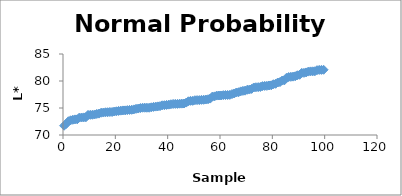
| Category | Series 0 |
|---|---|
| 0.4166666666666667 | 71.72 |
| 1.25 | 72.05 |
| 2.0833333333333335 | 72.55 |
| 2.9166666666666665 | 72.72 |
| 3.75 | 72.82 |
| 4.583333333333334 | 72.89 |
| 5.416666666666667 | 72.9 |
| 6.250000000000001 | 73.22 |
| 7.083333333333334 | 73.24 |
| 7.916666666666667 | 73.26 |
| 8.75 | 73.28 |
| 9.583333333333334 | 73.72 |
| 10.416666666666666 | 73.74 |
| 11.25 | 73.75 |
| 12.083333333333334 | 73.8 |
| 12.916666666666666 | 73.9 |
| 13.75 | 73.96 |
| 14.583333333333334 | 74.13 |
| 15.416666666666666 | 74.16 |
| 16.25 | 74.21 |
| 17.083333333333336 | 74.22 |
| 17.916666666666668 | 74.26 |
| 18.750000000000004 | 74.26 |
| 19.583333333333336 | 74.35 |
| 20.416666666666668 | 74.39 |
| 21.250000000000004 | 74.46 |
| 22.083333333333336 | 74.51 |
| 22.916666666666668 | 74.55 |
| 23.750000000000004 | 74.56 |
| 24.583333333333336 | 74.61 |
| 25.416666666666668 | 74.64 |
| 26.250000000000004 | 74.67 |
| 27.083333333333336 | 74.74 |
| 27.916666666666668 | 74.85 |
| 28.750000000000004 | 74.9 |
| 29.583333333333336 | 74.99 |
| 30.416666666666668 | 75.05 |
| 31.250000000000004 | 75.05 |
| 32.083333333333336 | 75.05 |
| 32.916666666666664 | 75.05 |
| 33.75 | 75.13 |
| 34.583333333333336 | 75.2 |
| 35.416666666666664 | 75.26 |
| 36.25 | 75.3 |
| 37.083333333333336 | 75.35 |
| 37.916666666666664 | 75.5 |
| 38.75 | 75.52 |
| 39.583333333333336 | 75.57 |
| 40.416666666666664 | 75.62 |
| 41.25 | 75.69 |
| 42.083333333333336 | 75.75 |
| 42.916666666666664 | 75.76 |
| 43.75 | 75.76 |
| 44.583333333333336 | 75.8 |
| 45.416666666666664 | 75.81 |
| 46.25 | 75.83 |
| 47.083333333333336 | 76 |
| 47.916666666666664 | 76.24 |
| 48.75 | 76.33 |
| 49.583333333333336 | 76.33 |
| 50.416666666666664 | 76.44 |
| 51.25 | 76.46 |
| 52.083333333333336 | 76.46 |
| 52.916666666666664 | 76.51 |
| 53.75 | 76.52 |
| 54.583333333333336 | 76.57 |
| 55.416666666666664 | 76.62 |
| 56.25 | 76.74 |
| 57.083333333333336 | 77.11 |
| 57.916666666666664 | 77.15 |
| 58.75 | 77.3 |
| 59.583333333333336 | 77.31 |
| 60.416666666666664 | 77.32 |
| 61.25 | 77.38 |
| 62.083333333333336 | 77.4 |
| 62.916666666666664 | 77.41 |
| 63.75 | 77.43 |
| 64.58333333333334 | 77.58 |
| 65.41666666666667 | 77.69 |
| 66.25000000000001 | 77.87 |
| 67.08333333333334 | 77.92 |
| 67.91666666666667 | 78.08 |
| 68.75000000000001 | 78.17 |
| 69.58333333333334 | 78.21 |
| 70.41666666666667 | 78.38 |
| 71.25000000000001 | 78.42 |
| 72.08333333333334 | 78.54 |
| 72.91666666666667 | 78.8 |
| 73.75000000000001 | 78.84 |
| 74.58333333333334 | 78.86 |
| 75.41666666666667 | 78.9 |
| 76.25000000000001 | 79.05 |
| 77.08333333333334 | 79.09 |
| 77.91666666666667 | 79.1 |
| 78.75000000000001 | 79.17 |
| 79.58333333333334 | 79.21 |
| 80.41666666666667 | 79.4 |
| 81.25000000000001 | 79.48 |
| 82.08333333333334 | 79.72 |
| 82.91666666666667 | 79.8 |
| 83.75000000000001 | 80.08 |
| 84.58333333333334 | 80.11 |
| 85.41666666666667 | 80.6 |
| 86.25000000000001 | 80.73 |
| 87.08333333333334 | 80.77 |
| 87.91666666666667 | 80.81 |
| 88.75000000000001 | 80.88 |
| 89.58333333333334 | 81.06 |
| 90.41666666666667 | 81.15 |
| 91.25000000000001 | 81.5 |
| 92.08333333333334 | 81.51 |
| 92.91666666666667 | 81.59 |
| 93.75000000000001 | 81.74 |
| 94.58333333333334 | 81.78 |
| 95.41666666666667 | 81.79 |
| 96.25000000000001 | 81.8 |
| 97.08333333333334 | 82 |
| 97.91666666666667 | 82.05 |
| 98.75000000000001 | 82.06 |
| 99.58333333333334 | 82.08 |